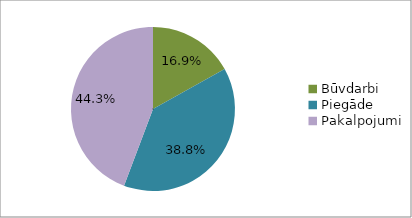
| Category | Series 0 |
|---|---|
| Būvdarbi | 0.169 |
| Piegāde | 0.388 |
| Pakalpojumi | 0.443 |